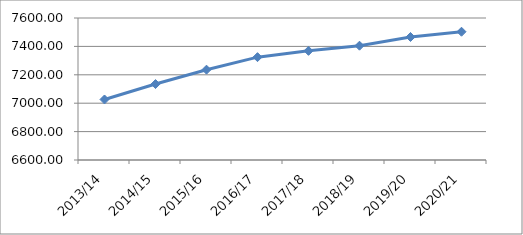
| Category | Series 0 |
|---|---|
| 2013/14 | 7026.07 |
| 2014/15 | 7134.86 |
| 2015/16 | 7236.01 |
| 2016/17 | 7324.34 |
| 2017/18 | 7368.7 |
| 2018/19 | 7404.8 |
| 2019/20 | 7466.25 |
| 2020/21 | 7503.278 |